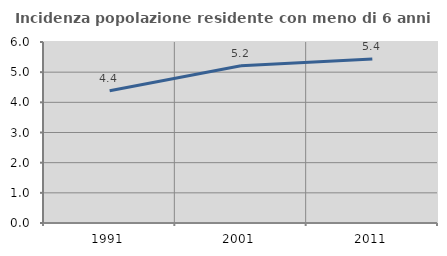
| Category | Incidenza popolazione residente con meno di 6 anni |
|---|---|
| 1991.0 | 4.382 |
| 2001.0 | 5.21 |
| 2011.0 | 5.44 |